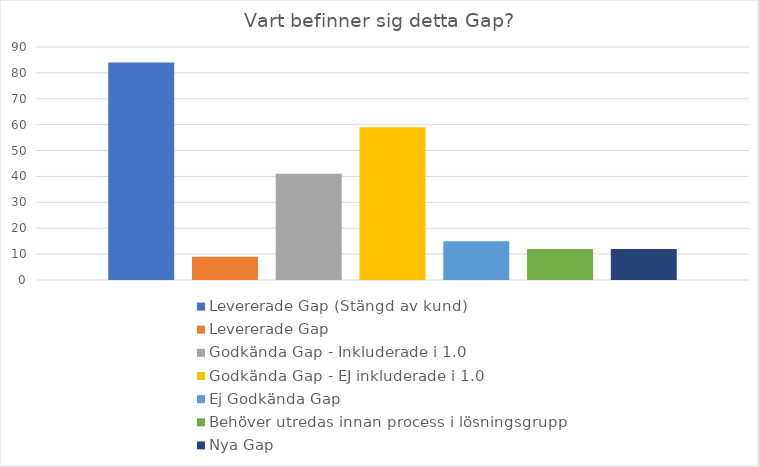
| Category | Levererade Gap (Stängd av kund) | Levererade Gap | Godkända Gap - Inkluderade i 1.0 | Godkända Gap - EJ inkluderade i 1.0 | Ej Godkända Gap | Behöver utredas innan process i lösningsgrupp | Nya Gap |
|---|---|---|---|---|---|---|---|
| 0 | 84 | 9 | 41 | 59 | 15 | 12 | 12 |